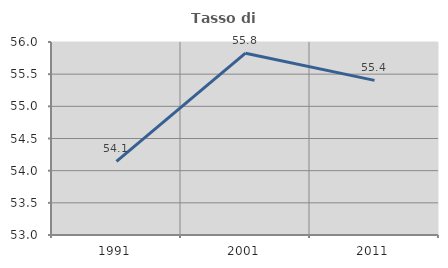
| Category | Tasso di occupazione   |
|---|---|
| 1991.0 | 54.145 |
| 2001.0 | 55.827 |
| 2011.0 | 55.404 |